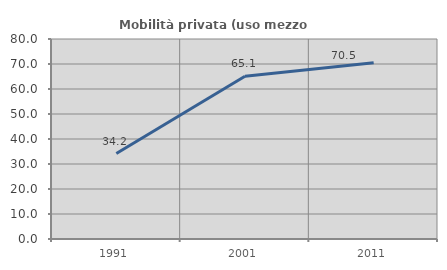
| Category | Mobilità privata (uso mezzo privato) |
|---|---|
| 1991.0 | 34.194 |
| 2001.0 | 65.133 |
| 2011.0 | 70.509 |